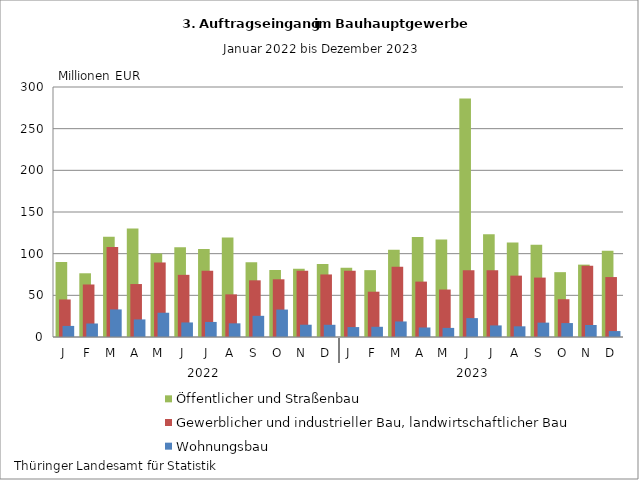
| Category | Öffentlicher und Straßenbau | Gewerblicher und industrieller Bau, landwirtschaftlicher Bau | Wohnungsbau |
|---|---|---|---|
| J | 89.898 | 45.03 | 13.303 |
| F | 76.468 | 63.016 | 16.201 |
| M | 120.415 | 108.104 | 33.096 |
| A | 130.248 | 63.544 | 21.098 |
| M | 100.219 | 89.431 | 29.118 |
| J | 107.714 | 74.595 | 17.457 |
| J | 105.492 | 79.466 | 18.073 |
| A | 119.395 | 51.153 | 16.405 |
| S | 89.568 | 68.016 | 25.412 |
| O | 80.379 | 69.241 | 32.933 |
| N | 81.901 | 79.61 | 14.737 |
| D | 87.459 | 75.055 | 14.652 |
| J | 82.956 | 79.504 | 11.906 |
| F | 80.222 | 54.36 | 12.247 |
| M | 104.683 | 84.279 | 18.641 |
| A | 120.066 | 66.477 | 11.421 |
| M | 117.098 | 56.95 | 10.915 |
| J | 286.207 | 80.136 | 22.651 |
| J | 123.163 | 79.991 | 13.905 |
| A | 113.484 | 73.645 | 12.822 |
| S | 110.834 | 71.293 | 17.237 |
| O | 77.809 | 45.319 | 16.722 |
| N | 86.836 | 85.364 | 14.414 |
| D | 103.511 | 71.928 | 7.13 |